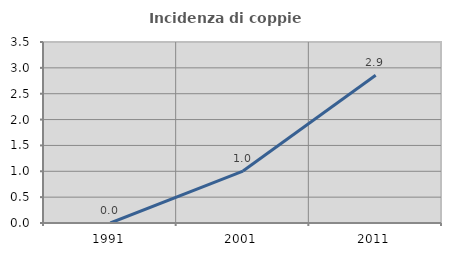
| Category | Incidenza di coppie miste |
|---|---|
| 1991.0 | 0 |
| 2001.0 | 1.005 |
| 2011.0 | 2.857 |